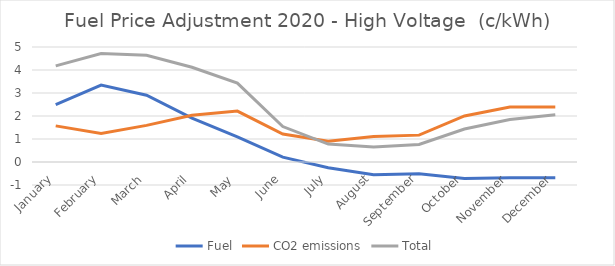
| Category | Fuel | CO2 emissions | Total |
|---|---|---|---|
| January | 2.499 | 1.57 | 4.178 |
| February | 3.342 | 1.235 | 4.716 |
| March | 2.902 | 1.592 | 4.64 |
| April | 1.908 | 2.033 | 4.118 |
| May | 1.094 | 2.215 | 3.43 |
| June | 0.211 | 1.214 | 1.541 |
| July | -0.25 | 0.904 | 0.781 |
| August | -0.55 | 1.106 | 0.658 |
| September | -0.513 | 1.168 | 0.763 |
| October | -0.719 | 2.003 | 1.436 |
| November | -0.68 | 2.389 | 1.845 |
| December | -0.68 | 2.389 | 2.059 |